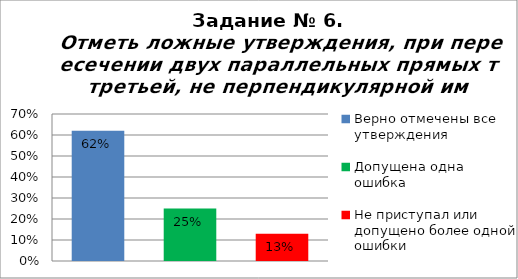
| Category | Отметь ложные утверждения, при пересечении двух параллельных прямых третьей, не перпендикулярной им. |
|---|---|
| Верно отмечены все утверждения | 0.62 |
| Допущена одна ошибка | 0.25 |
| Не приступал или допущено более одной ошибки | 0.13 |